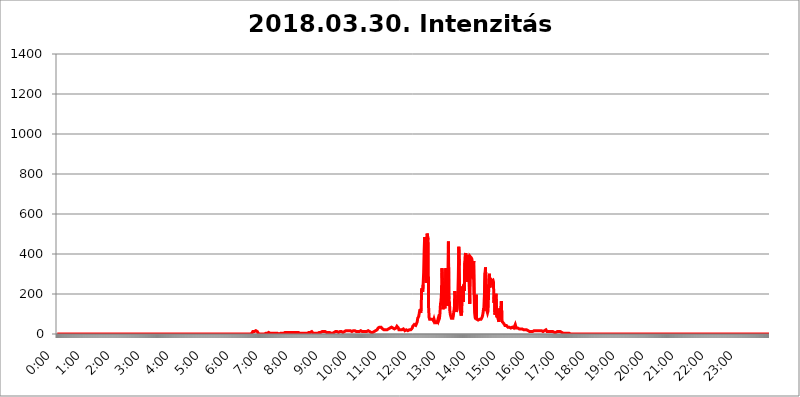
| Category | 2018.03.30. Intenzitás [W/m^2] |
|---|---|
| 0.0 | 0 |
| 0.0006944444444444445 | 0 |
| 0.001388888888888889 | 0 |
| 0.0020833333333333333 | 0 |
| 0.002777777777777778 | 0 |
| 0.003472222222222222 | 0 |
| 0.004166666666666667 | 0 |
| 0.004861111111111111 | 0 |
| 0.005555555555555556 | 0 |
| 0.0062499999999999995 | 0 |
| 0.006944444444444444 | 0 |
| 0.007638888888888889 | 0 |
| 0.008333333333333333 | 0 |
| 0.009027777777777779 | 0 |
| 0.009722222222222222 | 0 |
| 0.010416666666666666 | 0 |
| 0.011111111111111112 | 0 |
| 0.011805555555555555 | 0 |
| 0.012499999999999999 | 0 |
| 0.013194444444444444 | 0 |
| 0.013888888888888888 | 0 |
| 0.014583333333333332 | 0 |
| 0.015277777777777777 | 0 |
| 0.015972222222222224 | 0 |
| 0.016666666666666666 | 0 |
| 0.017361111111111112 | 0 |
| 0.018055555555555557 | 0 |
| 0.01875 | 0 |
| 0.019444444444444445 | 0 |
| 0.02013888888888889 | 0 |
| 0.020833333333333332 | 0 |
| 0.02152777777777778 | 0 |
| 0.022222222222222223 | 0 |
| 0.02291666666666667 | 0 |
| 0.02361111111111111 | 0 |
| 0.024305555555555556 | 0 |
| 0.024999999999999998 | 0 |
| 0.025694444444444447 | 0 |
| 0.02638888888888889 | 0 |
| 0.027083333333333334 | 0 |
| 0.027777777777777776 | 0 |
| 0.02847222222222222 | 0 |
| 0.029166666666666664 | 0 |
| 0.029861111111111113 | 0 |
| 0.030555555555555555 | 0 |
| 0.03125 | 0 |
| 0.03194444444444445 | 0 |
| 0.03263888888888889 | 0 |
| 0.03333333333333333 | 0 |
| 0.034027777777777775 | 0 |
| 0.034722222222222224 | 0 |
| 0.035416666666666666 | 0 |
| 0.036111111111111115 | 0 |
| 0.03680555555555556 | 0 |
| 0.0375 | 0 |
| 0.03819444444444444 | 0 |
| 0.03888888888888889 | 0 |
| 0.03958333333333333 | 0 |
| 0.04027777777777778 | 0 |
| 0.04097222222222222 | 0 |
| 0.041666666666666664 | 0 |
| 0.042361111111111106 | 0 |
| 0.04305555555555556 | 0 |
| 0.043750000000000004 | 0 |
| 0.044444444444444446 | 0 |
| 0.04513888888888889 | 0 |
| 0.04583333333333334 | 0 |
| 0.04652777777777778 | 0 |
| 0.04722222222222222 | 0 |
| 0.04791666666666666 | 0 |
| 0.04861111111111111 | 0 |
| 0.049305555555555554 | 0 |
| 0.049999999999999996 | 0 |
| 0.05069444444444445 | 0 |
| 0.051388888888888894 | 0 |
| 0.052083333333333336 | 0 |
| 0.05277777777777778 | 0 |
| 0.05347222222222222 | 0 |
| 0.05416666666666667 | 0 |
| 0.05486111111111111 | 0 |
| 0.05555555555555555 | 0 |
| 0.05625 | 0 |
| 0.05694444444444444 | 0 |
| 0.057638888888888885 | 0 |
| 0.05833333333333333 | 0 |
| 0.05902777777777778 | 0 |
| 0.059722222222222225 | 0 |
| 0.06041666666666667 | 0 |
| 0.061111111111111116 | 0 |
| 0.06180555555555556 | 0 |
| 0.0625 | 0 |
| 0.06319444444444444 | 0 |
| 0.06388888888888888 | 0 |
| 0.06458333333333334 | 0 |
| 0.06527777777777778 | 0 |
| 0.06597222222222222 | 0 |
| 0.06666666666666667 | 0 |
| 0.06736111111111111 | 0 |
| 0.06805555555555555 | 0 |
| 0.06874999999999999 | 0 |
| 0.06944444444444443 | 0 |
| 0.07013888888888889 | 0 |
| 0.07083333333333333 | 0 |
| 0.07152777777777779 | 0 |
| 0.07222222222222223 | 0 |
| 0.07291666666666667 | 0 |
| 0.07361111111111111 | 0 |
| 0.07430555555555556 | 0 |
| 0.075 | 0 |
| 0.07569444444444444 | 0 |
| 0.0763888888888889 | 0 |
| 0.07708333333333334 | 0 |
| 0.07777777777777778 | 0 |
| 0.07847222222222222 | 0 |
| 0.07916666666666666 | 0 |
| 0.0798611111111111 | 0 |
| 0.08055555555555556 | 0 |
| 0.08125 | 0 |
| 0.08194444444444444 | 0 |
| 0.08263888888888889 | 0 |
| 0.08333333333333333 | 0 |
| 0.08402777777777777 | 0 |
| 0.08472222222222221 | 0 |
| 0.08541666666666665 | 0 |
| 0.08611111111111112 | 0 |
| 0.08680555555555557 | 0 |
| 0.08750000000000001 | 0 |
| 0.08819444444444445 | 0 |
| 0.08888888888888889 | 0 |
| 0.08958333333333333 | 0 |
| 0.09027777777777778 | 0 |
| 0.09097222222222222 | 0 |
| 0.09166666666666667 | 0 |
| 0.09236111111111112 | 0 |
| 0.09305555555555556 | 0 |
| 0.09375 | 0 |
| 0.09444444444444444 | 0 |
| 0.09513888888888888 | 0 |
| 0.09583333333333333 | 0 |
| 0.09652777777777777 | 0 |
| 0.09722222222222222 | 0 |
| 0.09791666666666667 | 0 |
| 0.09861111111111111 | 0 |
| 0.09930555555555555 | 0 |
| 0.09999999999999999 | 0 |
| 0.10069444444444443 | 0 |
| 0.1013888888888889 | 0 |
| 0.10208333333333335 | 0 |
| 0.10277777777777779 | 0 |
| 0.10347222222222223 | 0 |
| 0.10416666666666667 | 0 |
| 0.10486111111111111 | 0 |
| 0.10555555555555556 | 0 |
| 0.10625 | 0 |
| 0.10694444444444444 | 0 |
| 0.1076388888888889 | 0 |
| 0.10833333333333334 | 0 |
| 0.10902777777777778 | 0 |
| 0.10972222222222222 | 0 |
| 0.1111111111111111 | 0 |
| 0.11180555555555556 | 0 |
| 0.11180555555555556 | 0 |
| 0.1125 | 0 |
| 0.11319444444444444 | 0 |
| 0.11388888888888889 | 0 |
| 0.11458333333333333 | 0 |
| 0.11527777777777777 | 0 |
| 0.11597222222222221 | 0 |
| 0.11666666666666665 | 0 |
| 0.1173611111111111 | 0 |
| 0.11805555555555557 | 0 |
| 0.11944444444444445 | 0 |
| 0.12013888888888889 | 0 |
| 0.12083333333333333 | 0 |
| 0.12152777777777778 | 0 |
| 0.12222222222222223 | 0 |
| 0.12291666666666667 | 0 |
| 0.12291666666666667 | 0 |
| 0.12361111111111112 | 0 |
| 0.12430555555555556 | 0 |
| 0.125 | 0 |
| 0.12569444444444444 | 0 |
| 0.12638888888888888 | 0 |
| 0.12708333333333333 | 0 |
| 0.16875 | 0 |
| 0.12847222222222224 | 0 |
| 0.12916666666666668 | 0 |
| 0.12986111111111112 | 0 |
| 0.13055555555555556 | 0 |
| 0.13125 | 0 |
| 0.13194444444444445 | 0 |
| 0.1326388888888889 | 0 |
| 0.13333333333333333 | 0 |
| 0.13402777777777777 | 0 |
| 0.13402777777777777 | 0 |
| 0.13472222222222222 | 0 |
| 0.13541666666666666 | 0 |
| 0.1361111111111111 | 0 |
| 0.13749999999999998 | 0 |
| 0.13819444444444443 | 0 |
| 0.1388888888888889 | 0 |
| 0.13958333333333334 | 0 |
| 0.14027777777777778 | 0 |
| 0.14097222222222222 | 0 |
| 0.14166666666666666 | 0 |
| 0.1423611111111111 | 0 |
| 0.14305555555555557 | 0 |
| 0.14375000000000002 | 0 |
| 0.14444444444444446 | 0 |
| 0.1451388888888889 | 0 |
| 0.1451388888888889 | 0 |
| 0.14652777777777778 | 0 |
| 0.14722222222222223 | 0 |
| 0.14791666666666667 | 0 |
| 0.1486111111111111 | 0 |
| 0.14930555555555555 | 0 |
| 0.15 | 0 |
| 0.15069444444444444 | 0 |
| 0.15138888888888888 | 0 |
| 0.15208333333333332 | 0 |
| 0.15277777777777776 | 0 |
| 0.15347222222222223 | 0 |
| 0.15416666666666667 | 0 |
| 0.15486111111111112 | 0 |
| 0.15555555555555556 | 0 |
| 0.15625 | 0 |
| 0.15694444444444444 | 0 |
| 0.15763888888888888 | 0 |
| 0.15833333333333333 | 0 |
| 0.15902777777777777 | 0 |
| 0.15972222222222224 | 0 |
| 0.16041666666666668 | 0 |
| 0.16111111111111112 | 0 |
| 0.16180555555555556 | 0 |
| 0.1625 | 0 |
| 0.16319444444444445 | 0 |
| 0.1638888888888889 | 0 |
| 0.16458333333333333 | 0 |
| 0.16527777777777777 | 0 |
| 0.16597222222222222 | 0 |
| 0.16666666666666666 | 0 |
| 0.1673611111111111 | 0 |
| 0.16805555555555554 | 0 |
| 0.16874999999999998 | 0 |
| 0.16944444444444443 | 0 |
| 0.17013888888888887 | 0 |
| 0.1708333333333333 | 0 |
| 0.17152777777777775 | 0 |
| 0.17222222222222225 | 0 |
| 0.1729166666666667 | 0 |
| 0.17361111111111113 | 0 |
| 0.17430555555555557 | 0 |
| 0.17500000000000002 | 0 |
| 0.17569444444444446 | 0 |
| 0.1763888888888889 | 0 |
| 0.17708333333333334 | 0 |
| 0.17777777777777778 | 0 |
| 0.17847222222222223 | 0 |
| 0.17916666666666667 | 0 |
| 0.1798611111111111 | 0 |
| 0.18055555555555555 | 0 |
| 0.18125 | 0 |
| 0.18194444444444444 | 0 |
| 0.1826388888888889 | 0 |
| 0.18333333333333335 | 0 |
| 0.1840277777777778 | 0 |
| 0.18472222222222223 | 0 |
| 0.18541666666666667 | 0 |
| 0.18611111111111112 | 0 |
| 0.18680555555555556 | 0 |
| 0.1875 | 0 |
| 0.18819444444444444 | 0 |
| 0.18888888888888888 | 0 |
| 0.18958333333333333 | 0 |
| 0.19027777777777777 | 0 |
| 0.1909722222222222 | 0 |
| 0.19166666666666665 | 0 |
| 0.19236111111111112 | 0 |
| 0.19305555555555554 | 0 |
| 0.19375 | 0 |
| 0.19444444444444445 | 0 |
| 0.1951388888888889 | 0 |
| 0.19583333333333333 | 0 |
| 0.19652777777777777 | 0 |
| 0.19722222222222222 | 0 |
| 0.19791666666666666 | 0 |
| 0.1986111111111111 | 0 |
| 0.19930555555555554 | 0 |
| 0.19999999999999998 | 0 |
| 0.20069444444444443 | 0 |
| 0.20138888888888887 | 0 |
| 0.2020833333333333 | 0 |
| 0.2027777777777778 | 0 |
| 0.2034722222222222 | 0 |
| 0.2041666666666667 | 0 |
| 0.20486111111111113 | 0 |
| 0.20555555555555557 | 0 |
| 0.20625000000000002 | 0 |
| 0.20694444444444446 | 0 |
| 0.2076388888888889 | 0 |
| 0.20833333333333334 | 0 |
| 0.20902777777777778 | 0 |
| 0.20972222222222223 | 0 |
| 0.21041666666666667 | 0 |
| 0.2111111111111111 | 0 |
| 0.21180555555555555 | 0 |
| 0.2125 | 0 |
| 0.21319444444444444 | 0 |
| 0.2138888888888889 | 0 |
| 0.21458333333333335 | 0 |
| 0.2152777777777778 | 0 |
| 0.21597222222222223 | 0 |
| 0.21666666666666667 | 0 |
| 0.21736111111111112 | 0 |
| 0.21805555555555556 | 0 |
| 0.21875 | 0 |
| 0.21944444444444444 | 0 |
| 0.22013888888888888 | 0 |
| 0.22083333333333333 | 0 |
| 0.22152777777777777 | 0 |
| 0.2222222222222222 | 0 |
| 0.22291666666666665 | 0 |
| 0.2236111111111111 | 0 |
| 0.22430555555555556 | 0 |
| 0.225 | 0 |
| 0.22569444444444445 | 0 |
| 0.2263888888888889 | 0 |
| 0.22708333333333333 | 0 |
| 0.22777777777777777 | 0 |
| 0.22847222222222222 | 0 |
| 0.22916666666666666 | 0 |
| 0.2298611111111111 | 0 |
| 0.23055555555555554 | 0 |
| 0.23124999999999998 | 0 |
| 0.23194444444444443 | 0 |
| 0.23263888888888887 | 0 |
| 0.2333333333333333 | 0 |
| 0.2340277777777778 | 0 |
| 0.2347222222222222 | 0 |
| 0.2354166666666667 | 0 |
| 0.23611111111111113 | 0 |
| 0.23680555555555557 | 0 |
| 0.23750000000000002 | 0 |
| 0.23819444444444446 | 0 |
| 0.2388888888888889 | 0 |
| 0.23958333333333334 | 0 |
| 0.24027777777777778 | 0 |
| 0.24097222222222223 | 0 |
| 0.24166666666666667 | 0 |
| 0.2423611111111111 | 0 |
| 0.24305555555555555 | 0 |
| 0.24375 | 0 |
| 0.24444444444444446 | 0 |
| 0.24513888888888888 | 0 |
| 0.24583333333333335 | 0 |
| 0.2465277777777778 | 0 |
| 0.24722222222222223 | 0 |
| 0.24791666666666667 | 0 |
| 0.24861111111111112 | 0 |
| 0.24930555555555556 | 0 |
| 0.25 | 0 |
| 0.25069444444444444 | 0 |
| 0.2513888888888889 | 0 |
| 0.2520833333333333 | 0 |
| 0.25277777777777777 | 0 |
| 0.2534722222222222 | 0 |
| 0.25416666666666665 | 0 |
| 0.2548611111111111 | 0 |
| 0.2555555555555556 | 0 |
| 0.25625000000000003 | 0 |
| 0.2569444444444445 | 0 |
| 0.2576388888888889 | 0 |
| 0.25833333333333336 | 0 |
| 0.2590277777777778 | 0 |
| 0.25972222222222224 | 0 |
| 0.2604166666666667 | 0 |
| 0.2611111111111111 | 0 |
| 0.26180555555555557 | 0 |
| 0.2625 | 0 |
| 0.26319444444444445 | 0 |
| 0.2638888888888889 | 0 |
| 0.26458333333333334 | 0 |
| 0.2652777777777778 | 0 |
| 0.2659722222222222 | 0 |
| 0.26666666666666666 | 0 |
| 0.2673611111111111 | 0 |
| 0.26805555555555555 | 0 |
| 0.26875 | 0 |
| 0.26944444444444443 | 0 |
| 0.2701388888888889 | 0 |
| 0.2708333333333333 | 0 |
| 0.27152777777777776 | 3.525 |
| 0.2722222222222222 | 3.525 |
| 0.27291666666666664 | 3.525 |
| 0.2736111111111111 | 7.887 |
| 0.2743055555555555 | 12.257 |
| 0.27499999999999997 | 12.257 |
| 0.27569444444444446 | 12.257 |
| 0.27638888888888885 | 12.257 |
| 0.27708333333333335 | 12.257 |
| 0.2777777777777778 | 12.257 |
| 0.27847222222222223 | 16.636 |
| 0.2791666666666667 | 21.024 |
| 0.2798611111111111 | 16.636 |
| 0.28055555555555556 | 12.257 |
| 0.28125 | 7.887 |
| 0.28194444444444444 | 3.525 |
| 0.2826388888888889 | 3.525 |
| 0.2833333333333333 | 0 |
| 0.28402777777777777 | 0 |
| 0.2847222222222222 | 0 |
| 0.28541666666666665 | 0 |
| 0.28611111111111115 | 0 |
| 0.28680555555555554 | 0 |
| 0.28750000000000003 | 0 |
| 0.2881944444444445 | 0 |
| 0.2888888888888889 | 0 |
| 0.28958333333333336 | 0 |
| 0.2902777777777778 | 0 |
| 0.29097222222222224 | 3.525 |
| 0.2916666666666667 | 3.525 |
| 0.2923611111111111 | 3.525 |
| 0.29305555555555557 | 3.525 |
| 0.29375 | 3.525 |
| 0.29444444444444445 | 3.525 |
| 0.2951388888888889 | 3.525 |
| 0.29583333333333334 | 3.525 |
| 0.2965277777777778 | 7.887 |
| 0.2972222222222222 | 7.887 |
| 0.29791666666666666 | 7.887 |
| 0.2986111111111111 | 3.525 |
| 0.29930555555555555 | 3.525 |
| 0.3 | 3.525 |
| 0.30069444444444443 | 3.525 |
| 0.3013888888888889 | 3.525 |
| 0.3020833333333333 | 3.525 |
| 0.30277777777777776 | 3.525 |
| 0.3034722222222222 | 3.525 |
| 0.30416666666666664 | 3.525 |
| 0.3048611111111111 | 3.525 |
| 0.3055555555555555 | 3.525 |
| 0.30624999999999997 | 3.525 |
| 0.3069444444444444 | 3.525 |
| 0.3076388888888889 | 3.525 |
| 0.30833333333333335 | 3.525 |
| 0.3090277777777778 | 3.525 |
| 0.30972222222222223 | 0 |
| 0.3104166666666667 | 0 |
| 0.3111111111111111 | 0 |
| 0.31180555555555556 | 0 |
| 0.3125 | 0 |
| 0.31319444444444444 | 3.525 |
| 0.3138888888888889 | 3.525 |
| 0.3145833333333333 | 3.525 |
| 0.31527777777777777 | 3.525 |
| 0.3159722222222222 | 3.525 |
| 0.31666666666666665 | 3.525 |
| 0.31736111111111115 | 3.525 |
| 0.31805555555555554 | 3.525 |
| 0.31875000000000003 | 3.525 |
| 0.3194444444444445 | 7.887 |
| 0.3201388888888889 | 7.887 |
| 0.32083333333333336 | 7.887 |
| 0.3215277777777778 | 7.887 |
| 0.32222222222222224 | 7.887 |
| 0.3229166666666667 | 7.887 |
| 0.3236111111111111 | 7.887 |
| 0.32430555555555557 | 7.887 |
| 0.325 | 7.887 |
| 0.32569444444444445 | 7.887 |
| 0.3263888888888889 | 7.887 |
| 0.32708333333333334 | 7.887 |
| 0.3277777777777778 | 7.887 |
| 0.3284722222222222 | 7.887 |
| 0.32916666666666666 | 7.887 |
| 0.3298611111111111 | 7.887 |
| 0.33055555555555555 | 7.887 |
| 0.33125 | 7.887 |
| 0.33194444444444443 | 7.887 |
| 0.3326388888888889 | 7.887 |
| 0.3333333333333333 | 7.887 |
| 0.3340277777777778 | 7.887 |
| 0.3347222222222222 | 7.887 |
| 0.3354166666666667 | 7.887 |
| 0.3361111111111111 | 7.887 |
| 0.3368055555555556 | 7.887 |
| 0.33749999999999997 | 7.887 |
| 0.33819444444444446 | 7.887 |
| 0.33888888888888885 | 3.525 |
| 0.33958333333333335 | 3.525 |
| 0.34027777777777773 | 3.525 |
| 0.34097222222222223 | 3.525 |
| 0.3416666666666666 | 3.525 |
| 0.3423611111111111 | 3.525 |
| 0.3430555555555555 | 3.525 |
| 0.34375 | 3.525 |
| 0.3444444444444445 | 3.525 |
| 0.3451388888888889 | 3.525 |
| 0.3458333333333334 | 3.525 |
| 0.34652777777777777 | 3.525 |
| 0.34722222222222227 | 3.525 |
| 0.34791666666666665 | 3.525 |
| 0.34861111111111115 | 3.525 |
| 0.34930555555555554 | 3.525 |
| 0.35000000000000003 | 3.525 |
| 0.3506944444444444 | 3.525 |
| 0.3513888888888889 | 3.525 |
| 0.3520833333333333 | 3.525 |
| 0.3527777777777778 | 7.887 |
| 0.3534722222222222 | 7.887 |
| 0.3541666666666667 | 7.887 |
| 0.3548611111111111 | 7.887 |
| 0.35555555555555557 | 7.887 |
| 0.35625 | 12.257 |
| 0.35694444444444445 | 12.257 |
| 0.3576388888888889 | 7.887 |
| 0.35833333333333334 | 7.887 |
| 0.3590277777777778 | 3.525 |
| 0.3597222222222222 | 3.525 |
| 0.36041666666666666 | 3.525 |
| 0.3611111111111111 | 3.525 |
| 0.36180555555555555 | 3.525 |
| 0.3625 | 3.525 |
| 0.36319444444444443 | 3.525 |
| 0.3638888888888889 | 3.525 |
| 0.3645833333333333 | 3.525 |
| 0.3652777777777778 | 3.525 |
| 0.3659722222222222 | 3.525 |
| 0.3666666666666667 | 3.525 |
| 0.3673611111111111 | 7.887 |
| 0.3680555555555556 | 7.887 |
| 0.36874999999999997 | 3.525 |
| 0.36944444444444446 | 7.887 |
| 0.37013888888888885 | 7.887 |
| 0.37083333333333335 | 12.257 |
| 0.37152777777777773 | 12.257 |
| 0.37222222222222223 | 12.257 |
| 0.3729166666666666 | 12.257 |
| 0.3736111111111111 | 12.257 |
| 0.3743055555555555 | 12.257 |
| 0.375 | 12.257 |
| 0.3756944444444445 | 12.257 |
| 0.3763888888888889 | 12.257 |
| 0.3770833333333334 | 12.257 |
| 0.37777777777777777 | 7.887 |
| 0.37847222222222227 | 7.887 |
| 0.37916666666666665 | 7.887 |
| 0.37986111111111115 | 7.887 |
| 0.38055555555555554 | 7.887 |
| 0.38125000000000003 | 7.887 |
| 0.3819444444444444 | 7.887 |
| 0.3826388888888889 | 7.887 |
| 0.3833333333333333 | 7.887 |
| 0.3840277777777778 | 3.525 |
| 0.3847222222222222 | 7.887 |
| 0.3854166666666667 | 3.525 |
| 0.3861111111111111 | 3.525 |
| 0.38680555555555557 | 3.525 |
| 0.3875 | 7.887 |
| 0.38819444444444445 | 7.887 |
| 0.3888888888888889 | 7.887 |
| 0.38958333333333334 | 12.257 |
| 0.3902777777777778 | 12.257 |
| 0.3909722222222222 | 12.257 |
| 0.39166666666666666 | 16.636 |
| 0.3923611111111111 | 12.257 |
| 0.39305555555555555 | 12.257 |
| 0.39375 | 7.887 |
| 0.39444444444444443 | 7.887 |
| 0.3951388888888889 | 7.887 |
| 0.3958333333333333 | 7.887 |
| 0.3965277777777778 | 12.257 |
| 0.3972222222222222 | 12.257 |
| 0.3979166666666667 | 12.257 |
| 0.3986111111111111 | 12.257 |
| 0.3993055555555556 | 7.887 |
| 0.39999999999999997 | 7.887 |
| 0.40069444444444446 | 7.887 |
| 0.40138888888888885 | 12.257 |
| 0.40208333333333335 | 12.257 |
| 0.40277777777777773 | 12.257 |
| 0.40347222222222223 | 12.257 |
| 0.4041666666666666 | 12.257 |
| 0.4048611111111111 | 16.636 |
| 0.4055555555555555 | 16.636 |
| 0.40625 | 16.636 |
| 0.4069444444444445 | 16.636 |
| 0.4076388888888889 | 16.636 |
| 0.4083333333333334 | 16.636 |
| 0.40902777777777777 | 16.636 |
| 0.40972222222222227 | 16.636 |
| 0.41041666666666665 | 16.636 |
| 0.41111111111111115 | 16.636 |
| 0.41180555555555554 | 12.257 |
| 0.41250000000000003 | 12.257 |
| 0.4131944444444444 | 12.257 |
| 0.4138888888888889 | 12.257 |
| 0.4145833333333333 | 12.257 |
| 0.4152777777777778 | 16.636 |
| 0.4159722222222222 | 16.636 |
| 0.4166666666666667 | 16.636 |
| 0.4173611111111111 | 16.636 |
| 0.41805555555555557 | 16.636 |
| 0.41875 | 12.257 |
| 0.41944444444444445 | 12.257 |
| 0.4201388888888889 | 16.636 |
| 0.42083333333333334 | 12.257 |
| 0.4215277777777778 | 12.257 |
| 0.4222222222222222 | 12.257 |
| 0.42291666666666666 | 12.257 |
| 0.4236111111111111 | 12.257 |
| 0.42430555555555555 | 12.257 |
| 0.425 | 16.636 |
| 0.42569444444444443 | 16.636 |
| 0.4263888888888889 | 12.257 |
| 0.4270833333333333 | 12.257 |
| 0.4277777777777778 | 12.257 |
| 0.4284722222222222 | 7.887 |
| 0.4291666666666667 | 12.257 |
| 0.4298611111111111 | 12.257 |
| 0.4305555555555556 | 12.257 |
| 0.43124999999999997 | 12.257 |
| 0.43194444444444446 | 12.257 |
| 0.43263888888888885 | 12.257 |
| 0.43333333333333335 | 12.257 |
| 0.43402777777777773 | 12.257 |
| 0.43472222222222223 | 12.257 |
| 0.4354166666666666 | 12.257 |
| 0.4361111111111111 | 16.636 |
| 0.4368055555555555 | 21.024 |
| 0.4375 | 16.636 |
| 0.4381944444444445 | 12.257 |
| 0.4388888888888889 | 12.257 |
| 0.4395833333333334 | 7.887 |
| 0.44027777777777777 | 7.887 |
| 0.44097222222222227 | 7.887 |
| 0.44166666666666665 | 7.887 |
| 0.44236111111111115 | 7.887 |
| 0.44305555555555554 | 7.887 |
| 0.44375000000000003 | 12.257 |
| 0.4444444444444444 | 12.257 |
| 0.4451388888888889 | 12.257 |
| 0.4458333333333333 | 12.257 |
| 0.4465277777777778 | 16.636 |
| 0.4472222222222222 | 16.636 |
| 0.4479166666666667 | 16.636 |
| 0.4486111111111111 | 21.024 |
| 0.44930555555555557 | 25.419 |
| 0.45 | 29.823 |
| 0.45069444444444445 | 29.823 |
| 0.4513888888888889 | 34.234 |
| 0.45208333333333334 | 34.234 |
| 0.4527777777777778 | 38.653 |
| 0.4534722222222222 | 38.653 |
| 0.45416666666666666 | 34.234 |
| 0.4548611111111111 | 29.823 |
| 0.45555555555555555 | 29.823 |
| 0.45625 | 25.419 |
| 0.45694444444444443 | 21.024 |
| 0.4576388888888889 | 21.024 |
| 0.4583333333333333 | 21.024 |
| 0.4590277777777778 | 21.024 |
| 0.4597222222222222 | 21.024 |
| 0.4604166666666667 | 21.024 |
| 0.4611111111111111 | 21.024 |
| 0.4618055555555556 | 21.024 |
| 0.46249999999999997 | 21.024 |
| 0.46319444444444446 | 21.024 |
| 0.46388888888888885 | 21.024 |
| 0.46458333333333335 | 25.419 |
| 0.46527777777777773 | 29.823 |
| 0.46597222222222223 | 29.823 |
| 0.4666666666666666 | 29.823 |
| 0.4673611111111111 | 34.234 |
| 0.4680555555555555 | 34.234 |
| 0.46875 | 34.234 |
| 0.4694444444444445 | 34.234 |
| 0.4701388888888889 | 29.823 |
| 0.4708333333333334 | 29.823 |
| 0.47152777777777777 | 25.419 |
| 0.47222222222222227 | 25.419 |
| 0.47291666666666665 | 25.419 |
| 0.47361111111111115 | 29.823 |
| 0.47430555555555554 | 29.823 |
| 0.47500000000000003 | 29.823 |
| 0.4756944444444444 | 29.823 |
| 0.4763888888888889 | 38.653 |
| 0.4770833333333333 | 38.653 |
| 0.4777777777777778 | 34.234 |
| 0.4784722222222222 | 29.823 |
| 0.4791666666666667 | 21.024 |
| 0.4798611111111111 | 16.636 |
| 0.48055555555555557 | 21.024 |
| 0.48125 | 21.024 |
| 0.48194444444444445 | 21.024 |
| 0.4826388888888889 | 21.024 |
| 0.48333333333333334 | 21.024 |
| 0.4840277777777778 | 25.419 |
| 0.4847222222222222 | 25.419 |
| 0.48541666666666666 | 25.419 |
| 0.4861111111111111 | 21.024 |
| 0.48680555555555555 | 21.024 |
| 0.4875 | 16.636 |
| 0.48819444444444443 | 16.636 |
| 0.4888888888888889 | 16.636 |
| 0.4895833333333333 | 21.024 |
| 0.4902777777777778 | 21.024 |
| 0.4909722222222222 | 16.636 |
| 0.4916666666666667 | 16.636 |
| 0.4923611111111111 | 12.257 |
| 0.4930555555555556 | 16.636 |
| 0.49374999999999997 | 21.024 |
| 0.49444444444444446 | 21.024 |
| 0.49513888888888885 | 25.419 |
| 0.49583333333333335 | 21.024 |
| 0.49652777777777773 | 21.024 |
| 0.49722222222222223 | 25.419 |
| 0.4979166666666666 | 29.823 |
| 0.4986111111111111 | 38.653 |
| 0.4993055555555555 | 38.653 |
| 0.5 | 43.079 |
| 0.5006944444444444 | 47.511 |
| 0.5013888888888889 | 43.079 |
| 0.5020833333333333 | 43.079 |
| 0.5027777777777778 | 43.079 |
| 0.5034722222222222 | 43.079 |
| 0.5041666666666667 | 47.511 |
| 0.5048611111111111 | 60.85 |
| 0.5055555555555555 | 78.722 |
| 0.50625 | 83.205 |
| 0.5069444444444444 | 87.692 |
| 0.5076388888888889 | 101.184 |
| 0.5083333333333333 | 114.716 |
| 0.5090277777777777 | 123.758 |
| 0.5097222222222222 | 105.69 |
| 0.5104166666666666 | 128.284 |
| 0.5111111111111112 | 228.436 |
| 0.5118055555555555 | 219.309 |
| 0.5125000000000001 | 210.182 |
| 0.5131944444444444 | 246.689 |
| 0.513888888888889 | 305.898 |
| 0.5145833333333333 | 414.035 |
| 0.5152777777777778 | 484.735 |
| 0.5159722222222222 | 471.582 |
| 0.5166666666666667 | 378.224 |
| 0.517361111111111 | 255.813 |
| 0.5180555555555556 | 440.702 |
| 0.5187499999999999 | 502.192 |
| 0.5194444444444445 | 506.542 |
| 0.5201388888888888 | 471.582 |
| 0.5208333333333334 | 132.814 |
| 0.5215277777777778 | 83.205 |
| 0.5222222222222223 | 74.246 |
| 0.5229166666666667 | 78.722 |
| 0.5236111111111111 | 78.722 |
| 0.5243055555555556 | 74.246 |
| 0.525 | 69.775 |
| 0.5256944444444445 | 74.246 |
| 0.5263888888888889 | 74.246 |
| 0.5270833333333333 | 69.775 |
| 0.5277777777777778 | 65.31 |
| 0.5284722222222222 | 74.246 |
| 0.5291666666666667 | 65.31 |
| 0.5298611111111111 | 60.85 |
| 0.5305555555555556 | 56.398 |
| 0.53125 | 51.951 |
| 0.5319444444444444 | 51.951 |
| 0.5326388888888889 | 56.398 |
| 0.5333333333333333 | 65.31 |
| 0.5340277777777778 | 74.246 |
| 0.5347222222222222 | 65.31 |
| 0.5354166666666667 | 69.775 |
| 0.5361111111111111 | 78.722 |
| 0.5368055555555555 | 105.69 |
| 0.5375 | 150.964 |
| 0.5381944444444444 | 164.605 |
| 0.5388888888888889 | 205.62 |
| 0.5395833333333333 | 328.584 |
| 0.5402777777777777 | 269.49 |
| 0.5409722222222222 | 123.758 |
| 0.5416666666666666 | 128.284 |
| 0.5423611111111112 | 155.509 |
| 0.5430555555555555 | 141.884 |
| 0.5437500000000001 | 128.284 |
| 0.5444444444444444 | 128.284 |
| 0.545138888888889 | 328.584 |
| 0.5458333333333333 | 141.884 |
| 0.5465277777777778 | 169.156 |
| 0.5472222222222222 | 242.127 |
| 0.5479166666666667 | 278.603 |
| 0.548611111111111 | 462.786 |
| 0.5493055555555556 | 173.709 |
| 0.5499999999999999 | 160.056 |
| 0.5506944444444445 | 114.716 |
| 0.5513888888888888 | 96.682 |
| 0.5520833333333334 | 92.184 |
| 0.5527777777777778 | 78.722 |
| 0.5534722222222223 | 74.246 |
| 0.5541666666666667 | 74.246 |
| 0.5548611111111111 | 78.722 |
| 0.5555555555555556 | 92.184 |
| 0.55625 | 114.716 |
| 0.5569444444444445 | 128.284 |
| 0.5576388888888889 | 214.746 |
| 0.5583333333333333 | 178.264 |
| 0.5590277777777778 | 178.264 |
| 0.5597222222222222 | 110.201 |
| 0.5604166666666667 | 123.758 |
| 0.5611111111111111 | 146.423 |
| 0.5618055555555556 | 187.378 |
| 0.5625 | 287.709 |
| 0.5631944444444444 | 436.27 |
| 0.5638888888888889 | 342.162 |
| 0.5645833333333333 | 128.284 |
| 0.5652777777777778 | 114.716 |
| 0.5659722222222222 | 101.184 |
| 0.5666666666666667 | 92.184 |
| 0.5673611111111111 | 114.716 |
| 0.5680555555555555 | 237.564 |
| 0.56875 | 233 |
| 0.5694444444444444 | 160.056 |
| 0.5701388888888889 | 246.689 |
| 0.5708333333333333 | 214.746 |
| 0.5715277777777777 | 355.712 |
| 0.5722222222222222 | 396.164 |
| 0.5729166666666666 | 405.108 |
| 0.5736111111111112 | 328.584 |
| 0.5743055555555555 | 292.259 |
| 0.5750000000000001 | 342.162 |
| 0.5756944444444444 | 260.373 |
| 0.576388888888889 | 333.113 |
| 0.5770833333333333 | 396.164 |
| 0.5777777777777778 | 391.685 |
| 0.5784722222222222 | 150.964 |
| 0.5791666666666667 | 387.202 |
| 0.579861111111111 | 387.202 |
| 0.5805555555555556 | 391.685 |
| 0.5812499999999999 | 378.224 |
| 0.5819444444444445 | 364.728 |
| 0.5826388888888888 | 355.712 |
| 0.5833333333333334 | 274.047 |
| 0.5840277777777778 | 364.728 |
| 0.5847222222222223 | 196.497 |
| 0.5854166666666667 | 105.69 |
| 0.5861111111111111 | 83.205 |
| 0.5868055555555556 | 74.246 |
| 0.5875 | 196.497 |
| 0.5881944444444445 | 74.246 |
| 0.5888888888888889 | 78.722 |
| 0.5895833333333333 | 69.775 |
| 0.5902777777777778 | 69.775 |
| 0.5909722222222222 | 74.246 |
| 0.5916666666666667 | 74.246 |
| 0.5923611111111111 | 74.246 |
| 0.5930555555555556 | 74.246 |
| 0.59375 | 74.246 |
| 0.5944444444444444 | 74.246 |
| 0.5951388888888889 | 78.722 |
| 0.5958333333333333 | 83.205 |
| 0.5965277777777778 | 92.184 |
| 0.5972222222222222 | 105.69 |
| 0.5979166666666667 | 128.284 |
| 0.5986111111111111 | 114.716 |
| 0.5993055555555555 | 119.235 |
| 0.6 | 305.898 |
| 0.6006944444444444 | 333.113 |
| 0.6013888888888889 | 191.937 |
| 0.6020833333333333 | 141.884 |
| 0.6027777777777777 | 114.716 |
| 0.6034722222222222 | 105.69 |
| 0.6041666666666666 | 114.716 |
| 0.6048611111111112 | 114.716 |
| 0.6055555555555555 | 269.49 |
| 0.6062500000000001 | 301.354 |
| 0.6069444444444444 | 233 |
| 0.607638888888889 | 278.603 |
| 0.6083333333333333 | 251.251 |
| 0.6090277777777778 | 264.932 |
| 0.6097222222222222 | 260.373 |
| 0.6104166666666667 | 269.49 |
| 0.611111111111111 | 269.49 |
| 0.6118055555555556 | 260.373 |
| 0.6124999999999999 | 155.509 |
| 0.6131944444444445 | 191.937 |
| 0.6138888888888888 | 96.682 |
| 0.6145833333333334 | 105.69 |
| 0.6152777777777778 | 201.058 |
| 0.6159722222222223 | 132.814 |
| 0.6166666666666667 | 83.205 |
| 0.6173611111111111 | 110.201 |
| 0.6180555555555556 | 78.722 |
| 0.61875 | 74.246 |
| 0.6194444444444445 | 60.85 |
| 0.6201388888888889 | 60.85 |
| 0.6208333333333333 | 128.284 |
| 0.6215277777777778 | 69.775 |
| 0.6222222222222222 | 74.246 |
| 0.6229166666666667 | 164.605 |
| 0.6236111111111111 | 69.775 |
| 0.6243055555555556 | 60.85 |
| 0.625 | 56.398 |
| 0.6256944444444444 | 56.398 |
| 0.6263888888888889 | 51.951 |
| 0.6270833333333333 | 47.511 |
| 0.6277777777777778 | 43.079 |
| 0.6284722222222222 | 43.079 |
| 0.6291666666666667 | 43.079 |
| 0.6298611111111111 | 43.079 |
| 0.6305555555555555 | 38.653 |
| 0.63125 | 38.653 |
| 0.6319444444444444 | 34.234 |
| 0.6326388888888889 | 34.234 |
| 0.6333333333333333 | 34.234 |
| 0.6340277777777777 | 34.234 |
| 0.6347222222222222 | 34.234 |
| 0.6354166666666666 | 29.823 |
| 0.6361111111111112 | 29.823 |
| 0.6368055555555555 | 29.823 |
| 0.6375000000000001 | 34.234 |
| 0.6381944444444444 | 34.234 |
| 0.638888888888889 | 34.234 |
| 0.6395833333333333 | 34.234 |
| 0.6402777777777778 | 29.823 |
| 0.6409722222222222 | 29.823 |
| 0.6416666666666667 | 29.823 |
| 0.642361111111111 | 47.511 |
| 0.6430555555555556 | 38.653 |
| 0.6437499999999999 | 29.823 |
| 0.6444444444444445 | 29.823 |
| 0.6451388888888888 | 29.823 |
| 0.6458333333333334 | 29.823 |
| 0.6465277777777778 | 25.419 |
| 0.6472222222222223 | 25.419 |
| 0.6479166666666667 | 25.419 |
| 0.6486111111111111 | 25.419 |
| 0.6493055555555556 | 25.419 |
| 0.65 | 25.419 |
| 0.6506944444444445 | 21.024 |
| 0.6513888888888889 | 21.024 |
| 0.6520833333333333 | 25.419 |
| 0.6527777777777778 | 21.024 |
| 0.6534722222222222 | 21.024 |
| 0.6541666666666667 | 21.024 |
| 0.6548611111111111 | 21.024 |
| 0.6555555555555556 | 21.024 |
| 0.65625 | 21.024 |
| 0.6569444444444444 | 21.024 |
| 0.6576388888888889 | 21.024 |
| 0.6583333333333333 | 21.024 |
| 0.6590277777777778 | 16.636 |
| 0.6597222222222222 | 16.636 |
| 0.6604166666666667 | 16.636 |
| 0.6611111111111111 | 12.257 |
| 0.6618055555555555 | 12.257 |
| 0.6625 | 12.257 |
| 0.6631944444444444 | 12.257 |
| 0.6638888888888889 | 12.257 |
| 0.6645833333333333 | 12.257 |
| 0.6652777777777777 | 12.257 |
| 0.6659722222222222 | 12.257 |
| 0.6666666666666666 | 12.257 |
| 0.6673611111111111 | 12.257 |
| 0.6680555555555556 | 12.257 |
| 0.6687500000000001 | 16.636 |
| 0.6694444444444444 | 16.636 |
| 0.6701388888888888 | 16.636 |
| 0.6708333333333334 | 16.636 |
| 0.6715277777777778 | 16.636 |
| 0.6722222222222222 | 16.636 |
| 0.6729166666666666 | 16.636 |
| 0.6736111111111112 | 16.636 |
| 0.6743055555555556 | 16.636 |
| 0.6749999999999999 | 16.636 |
| 0.6756944444444444 | 16.636 |
| 0.6763888888888889 | 16.636 |
| 0.6770833333333334 | 16.636 |
| 0.6777777777777777 | 21.024 |
| 0.6784722222222223 | 21.024 |
| 0.6791666666666667 | 16.636 |
| 0.6798611111111111 | 16.636 |
| 0.6805555555555555 | 16.636 |
| 0.68125 | 12.257 |
| 0.6819444444444445 | 16.636 |
| 0.6826388888888889 | 16.636 |
| 0.6833333333333332 | 16.636 |
| 0.6840277777777778 | 16.636 |
| 0.6847222222222222 | 21.024 |
| 0.6854166666666667 | 21.024 |
| 0.686111111111111 | 16.636 |
| 0.6868055555555556 | 12.257 |
| 0.6875 | 12.257 |
| 0.6881944444444444 | 12.257 |
| 0.688888888888889 | 12.257 |
| 0.6895833333333333 | 16.636 |
| 0.6902777777777778 | 12.257 |
| 0.6909722222222222 | 12.257 |
| 0.6916666666666668 | 12.257 |
| 0.6923611111111111 | 12.257 |
| 0.6930555555555555 | 12.257 |
| 0.69375 | 12.257 |
| 0.6944444444444445 | 12.257 |
| 0.6951388888888889 | 12.257 |
| 0.6958333333333333 | 12.257 |
| 0.6965277777777777 | 7.887 |
| 0.6972222222222223 | 7.887 |
| 0.6979166666666666 | 7.887 |
| 0.6986111111111111 | 7.887 |
| 0.6993055555555556 | 7.887 |
| 0.7000000000000001 | 7.887 |
| 0.7006944444444444 | 12.257 |
| 0.7013888888888888 | 12.257 |
| 0.7020833333333334 | 12.257 |
| 0.7027777777777778 | 12.257 |
| 0.7034722222222222 | 12.257 |
| 0.7041666666666666 | 7.887 |
| 0.7048611111111112 | 7.887 |
| 0.7055555555555556 | 12.257 |
| 0.7062499999999999 | 7.887 |
| 0.7069444444444444 | 7.887 |
| 0.7076388888888889 | 7.887 |
| 0.7083333333333334 | 3.525 |
| 0.7090277777777777 | 3.525 |
| 0.7097222222222223 | 3.525 |
| 0.7104166666666667 | 3.525 |
| 0.7111111111111111 | 3.525 |
| 0.7118055555555555 | 3.525 |
| 0.7125 | 3.525 |
| 0.7131944444444445 | 3.525 |
| 0.7138888888888889 | 3.525 |
| 0.7145833333333332 | 3.525 |
| 0.7152777777777778 | 3.525 |
| 0.7159722222222222 | 3.525 |
| 0.7166666666666667 | 3.525 |
| 0.717361111111111 | 3.525 |
| 0.7180555555555556 | 3.525 |
| 0.71875 | 3.525 |
| 0.7194444444444444 | 3.525 |
| 0.720138888888889 | 0 |
| 0.7208333333333333 | 0 |
| 0.7215277777777778 | 0 |
| 0.7222222222222222 | 0 |
| 0.7229166666666668 | 0 |
| 0.7236111111111111 | 0 |
| 0.7243055555555555 | 0 |
| 0.725 | 0 |
| 0.7256944444444445 | 0 |
| 0.7263888888888889 | 0 |
| 0.7270833333333333 | 0 |
| 0.7277777777777777 | 0 |
| 0.7284722222222223 | 0 |
| 0.7291666666666666 | 0 |
| 0.7298611111111111 | 0 |
| 0.7305555555555556 | 0 |
| 0.7312500000000001 | 0 |
| 0.7319444444444444 | 0 |
| 0.7326388888888888 | 0 |
| 0.7333333333333334 | 0 |
| 0.7340277777777778 | 0 |
| 0.7347222222222222 | 0 |
| 0.7354166666666666 | 0 |
| 0.7361111111111112 | 0 |
| 0.7368055555555556 | 0 |
| 0.7374999999999999 | 0 |
| 0.7381944444444444 | 0 |
| 0.7388888888888889 | 0 |
| 0.7395833333333334 | 0 |
| 0.7402777777777777 | 0 |
| 0.7409722222222223 | 0 |
| 0.7416666666666667 | 0 |
| 0.7423611111111111 | 0 |
| 0.7430555555555555 | 0 |
| 0.74375 | 0 |
| 0.7444444444444445 | 0 |
| 0.7451388888888889 | 0 |
| 0.7458333333333332 | 0 |
| 0.7465277777777778 | 0 |
| 0.7472222222222222 | 0 |
| 0.7479166666666667 | 0 |
| 0.748611111111111 | 0 |
| 0.7493055555555556 | 0 |
| 0.75 | 0 |
| 0.7506944444444444 | 0 |
| 0.751388888888889 | 0 |
| 0.7520833333333333 | 0 |
| 0.7527777777777778 | 0 |
| 0.7534722222222222 | 0 |
| 0.7541666666666668 | 0 |
| 0.7548611111111111 | 0 |
| 0.7555555555555555 | 0 |
| 0.75625 | 0 |
| 0.7569444444444445 | 0 |
| 0.7576388888888889 | 0 |
| 0.7583333333333333 | 0 |
| 0.7590277777777777 | 0 |
| 0.7597222222222223 | 0 |
| 0.7604166666666666 | 0 |
| 0.7611111111111111 | 0 |
| 0.7618055555555556 | 0 |
| 0.7625000000000001 | 0 |
| 0.7631944444444444 | 0 |
| 0.7638888888888888 | 0 |
| 0.7645833333333334 | 0 |
| 0.7652777777777778 | 0 |
| 0.7659722222222222 | 0 |
| 0.7666666666666666 | 0 |
| 0.7673611111111112 | 0 |
| 0.7680555555555556 | 0 |
| 0.7687499999999999 | 0 |
| 0.7694444444444444 | 0 |
| 0.7701388888888889 | 0 |
| 0.7708333333333334 | 0 |
| 0.7715277777777777 | 0 |
| 0.7722222222222223 | 0 |
| 0.7729166666666667 | 0 |
| 0.7736111111111111 | 0 |
| 0.7743055555555555 | 0 |
| 0.775 | 0 |
| 0.7756944444444445 | 0 |
| 0.7763888888888889 | 0 |
| 0.7770833333333332 | 0 |
| 0.7777777777777778 | 0 |
| 0.7784722222222222 | 0 |
| 0.7791666666666667 | 0 |
| 0.779861111111111 | 0 |
| 0.7805555555555556 | 0 |
| 0.78125 | 0 |
| 0.7819444444444444 | 0 |
| 0.782638888888889 | 0 |
| 0.7833333333333333 | 0 |
| 0.7840277777777778 | 0 |
| 0.7847222222222222 | 0 |
| 0.7854166666666668 | 0 |
| 0.7861111111111111 | 0 |
| 0.7868055555555555 | 0 |
| 0.7875 | 0 |
| 0.7881944444444445 | 0 |
| 0.7888888888888889 | 0 |
| 0.7895833333333333 | 0 |
| 0.7902777777777777 | 0 |
| 0.7909722222222223 | 0 |
| 0.7916666666666666 | 0 |
| 0.7923611111111111 | 0 |
| 0.7930555555555556 | 0 |
| 0.7937500000000001 | 0 |
| 0.7944444444444444 | 0 |
| 0.7951388888888888 | 0 |
| 0.7958333333333334 | 0 |
| 0.7965277777777778 | 0 |
| 0.7972222222222222 | 0 |
| 0.7979166666666666 | 0 |
| 0.7986111111111112 | 0 |
| 0.7993055555555556 | 0 |
| 0.7999999999999999 | 0 |
| 0.8006944444444444 | 0 |
| 0.8013888888888889 | 0 |
| 0.8020833333333334 | 0 |
| 0.8027777777777777 | 0 |
| 0.8034722222222223 | 0 |
| 0.8041666666666667 | 0 |
| 0.8048611111111111 | 0 |
| 0.8055555555555555 | 0 |
| 0.80625 | 0 |
| 0.8069444444444445 | 0 |
| 0.8076388888888889 | 0 |
| 0.8083333333333332 | 0 |
| 0.8090277777777778 | 0 |
| 0.8097222222222222 | 0 |
| 0.8104166666666667 | 0 |
| 0.811111111111111 | 0 |
| 0.8118055555555556 | 0 |
| 0.8125 | 0 |
| 0.8131944444444444 | 0 |
| 0.813888888888889 | 0 |
| 0.8145833333333333 | 0 |
| 0.8152777777777778 | 0 |
| 0.8159722222222222 | 0 |
| 0.8166666666666668 | 0 |
| 0.8173611111111111 | 0 |
| 0.8180555555555555 | 0 |
| 0.81875 | 0 |
| 0.8194444444444445 | 0 |
| 0.8201388888888889 | 0 |
| 0.8208333333333333 | 0 |
| 0.8215277777777777 | 0 |
| 0.8222222222222223 | 0 |
| 0.8229166666666666 | 0 |
| 0.8236111111111111 | 0 |
| 0.8243055555555556 | 0 |
| 0.8250000000000001 | 0 |
| 0.8256944444444444 | 0 |
| 0.8263888888888888 | 0 |
| 0.8270833333333334 | 0 |
| 0.8277777777777778 | 0 |
| 0.8284722222222222 | 0 |
| 0.8291666666666666 | 0 |
| 0.8298611111111112 | 0 |
| 0.8305555555555556 | 0 |
| 0.8312499999999999 | 0 |
| 0.8319444444444444 | 0 |
| 0.8326388888888889 | 0 |
| 0.8333333333333334 | 0 |
| 0.8340277777777777 | 0 |
| 0.8347222222222223 | 0 |
| 0.8354166666666667 | 0 |
| 0.8361111111111111 | 0 |
| 0.8368055555555555 | 0 |
| 0.8375 | 0 |
| 0.8381944444444445 | 0 |
| 0.8388888888888889 | 0 |
| 0.8395833333333332 | 0 |
| 0.8402777777777778 | 0 |
| 0.8409722222222222 | 0 |
| 0.8416666666666667 | 0 |
| 0.842361111111111 | 0 |
| 0.8430555555555556 | 0 |
| 0.84375 | 0 |
| 0.8444444444444444 | 0 |
| 0.845138888888889 | 0 |
| 0.8458333333333333 | 0 |
| 0.8465277777777778 | 0 |
| 0.8472222222222222 | 0 |
| 0.8479166666666668 | 0 |
| 0.8486111111111111 | 0 |
| 0.8493055555555555 | 0 |
| 0.85 | 0 |
| 0.8506944444444445 | 0 |
| 0.8513888888888889 | 0 |
| 0.8520833333333333 | 0 |
| 0.8527777777777777 | 0 |
| 0.8534722222222223 | 0 |
| 0.8541666666666666 | 0 |
| 0.8548611111111111 | 0 |
| 0.8555555555555556 | 0 |
| 0.8562500000000001 | 0 |
| 0.8569444444444444 | 0 |
| 0.8576388888888888 | 0 |
| 0.8583333333333334 | 0 |
| 0.8590277777777778 | 0 |
| 0.8597222222222222 | 0 |
| 0.8604166666666666 | 0 |
| 0.8611111111111112 | 0 |
| 0.8618055555555556 | 0 |
| 0.8624999999999999 | 0 |
| 0.8631944444444444 | 0 |
| 0.8638888888888889 | 0 |
| 0.8645833333333334 | 0 |
| 0.8652777777777777 | 0 |
| 0.8659722222222223 | 0 |
| 0.8666666666666667 | 0 |
| 0.8673611111111111 | 0 |
| 0.8680555555555555 | 0 |
| 0.86875 | 0 |
| 0.8694444444444445 | 0 |
| 0.8701388888888889 | 0 |
| 0.8708333333333332 | 0 |
| 0.8715277777777778 | 0 |
| 0.8722222222222222 | 0 |
| 0.8729166666666667 | 0 |
| 0.873611111111111 | 0 |
| 0.8743055555555556 | 0 |
| 0.875 | 0 |
| 0.8756944444444444 | 0 |
| 0.876388888888889 | 0 |
| 0.8770833333333333 | 0 |
| 0.8777777777777778 | 0 |
| 0.8784722222222222 | 0 |
| 0.8791666666666668 | 0 |
| 0.8798611111111111 | 0 |
| 0.8805555555555555 | 0 |
| 0.88125 | 0 |
| 0.8819444444444445 | 0 |
| 0.8826388888888889 | 0 |
| 0.8833333333333333 | 0 |
| 0.8840277777777777 | 0 |
| 0.8847222222222223 | 0 |
| 0.8854166666666666 | 0 |
| 0.8861111111111111 | 0 |
| 0.8868055555555556 | 0 |
| 0.8875000000000001 | 0 |
| 0.8881944444444444 | 0 |
| 0.8888888888888888 | 0 |
| 0.8895833333333334 | 0 |
| 0.8902777777777778 | 0 |
| 0.8909722222222222 | 0 |
| 0.8916666666666666 | 0 |
| 0.8923611111111112 | 0 |
| 0.8930555555555556 | 0 |
| 0.8937499999999999 | 0 |
| 0.8944444444444444 | 0 |
| 0.8951388888888889 | 0 |
| 0.8958333333333334 | 0 |
| 0.8965277777777777 | 0 |
| 0.8972222222222223 | 0 |
| 0.8979166666666667 | 0 |
| 0.8986111111111111 | 0 |
| 0.8993055555555555 | 0 |
| 0.9 | 0 |
| 0.9006944444444445 | 0 |
| 0.9013888888888889 | 0 |
| 0.9020833333333332 | 0 |
| 0.9027777777777778 | 0 |
| 0.9034722222222222 | 0 |
| 0.9041666666666667 | 0 |
| 0.904861111111111 | 0 |
| 0.9055555555555556 | 0 |
| 0.90625 | 0 |
| 0.9069444444444444 | 0 |
| 0.907638888888889 | 0 |
| 0.9083333333333333 | 0 |
| 0.9090277777777778 | 0 |
| 0.9097222222222222 | 0 |
| 0.9104166666666668 | 0 |
| 0.9111111111111111 | 0 |
| 0.9118055555555555 | 0 |
| 0.9125 | 0 |
| 0.9131944444444445 | 0 |
| 0.9138888888888889 | 0 |
| 0.9145833333333333 | 0 |
| 0.9152777777777777 | 0 |
| 0.9159722222222223 | 0 |
| 0.9166666666666666 | 0 |
| 0.9173611111111111 | 0 |
| 0.9180555555555556 | 0 |
| 0.9187500000000001 | 0 |
| 0.9194444444444444 | 0 |
| 0.9201388888888888 | 0 |
| 0.9208333333333334 | 0 |
| 0.9215277777777778 | 0 |
| 0.9222222222222222 | 0 |
| 0.9229166666666666 | 0 |
| 0.9236111111111112 | 0 |
| 0.9243055555555556 | 0 |
| 0.9249999999999999 | 0 |
| 0.9256944444444444 | 0 |
| 0.9263888888888889 | 0 |
| 0.9270833333333334 | 0 |
| 0.9277777777777777 | 0 |
| 0.9284722222222223 | 0 |
| 0.9291666666666667 | 0 |
| 0.9298611111111111 | 0 |
| 0.9305555555555555 | 0 |
| 0.93125 | 0 |
| 0.9319444444444445 | 0 |
| 0.9326388888888889 | 0 |
| 0.9333333333333332 | 0 |
| 0.9340277777777778 | 0 |
| 0.9347222222222222 | 0 |
| 0.9354166666666667 | 0 |
| 0.936111111111111 | 0 |
| 0.9368055555555556 | 0 |
| 0.9375 | 0 |
| 0.9381944444444444 | 0 |
| 0.938888888888889 | 0 |
| 0.9395833333333333 | 0 |
| 0.9402777777777778 | 0 |
| 0.9409722222222222 | 0 |
| 0.9416666666666668 | 0 |
| 0.9423611111111111 | 0 |
| 0.9430555555555555 | 0 |
| 0.94375 | 0 |
| 0.9444444444444445 | 0 |
| 0.9451388888888889 | 0 |
| 0.9458333333333333 | 0 |
| 0.9465277777777777 | 0 |
| 0.9472222222222223 | 0 |
| 0.9479166666666666 | 0 |
| 0.9486111111111111 | 0 |
| 0.9493055555555556 | 0 |
| 0.9500000000000001 | 0 |
| 0.9506944444444444 | 0 |
| 0.9513888888888888 | 0 |
| 0.9520833333333334 | 0 |
| 0.9527777777777778 | 0 |
| 0.9534722222222222 | 0 |
| 0.9541666666666666 | 0 |
| 0.9548611111111112 | 0 |
| 0.9555555555555556 | 0 |
| 0.9562499999999999 | 0 |
| 0.9569444444444444 | 0 |
| 0.9576388888888889 | 0 |
| 0.9583333333333334 | 0 |
| 0.9590277777777777 | 0 |
| 0.9597222222222223 | 0 |
| 0.9604166666666667 | 0 |
| 0.9611111111111111 | 0 |
| 0.9618055555555555 | 0 |
| 0.9625 | 0 |
| 0.9631944444444445 | 0 |
| 0.9638888888888889 | 0 |
| 0.9645833333333332 | 0 |
| 0.9652777777777778 | 0 |
| 0.9659722222222222 | 0 |
| 0.9666666666666667 | 0 |
| 0.967361111111111 | 0 |
| 0.9680555555555556 | 0 |
| 0.96875 | 0 |
| 0.9694444444444444 | 0 |
| 0.970138888888889 | 0 |
| 0.9708333333333333 | 0 |
| 0.9715277777777778 | 0 |
| 0.9722222222222222 | 0 |
| 0.9729166666666668 | 0 |
| 0.9736111111111111 | 0 |
| 0.9743055555555555 | 0 |
| 0.975 | 0 |
| 0.9756944444444445 | 0 |
| 0.9763888888888889 | 0 |
| 0.9770833333333333 | 0 |
| 0.9777777777777777 | 0 |
| 0.9784722222222223 | 0 |
| 0.9791666666666666 | 0 |
| 0.9798611111111111 | 0 |
| 0.9805555555555556 | 0 |
| 0.9812500000000001 | 0 |
| 0.9819444444444444 | 0 |
| 0.9826388888888888 | 0 |
| 0.9833333333333334 | 0 |
| 0.9840277777777778 | 0 |
| 0.9847222222222222 | 0 |
| 0.9854166666666666 | 0 |
| 0.9861111111111112 | 0 |
| 0.9868055555555556 | 0 |
| 0.9874999999999999 | 0 |
| 0.9881944444444444 | 0 |
| 0.9888888888888889 | 0 |
| 0.9895833333333334 | 0 |
| 0.9902777777777777 | 0 |
| 0.9909722222222223 | 0 |
| 0.9916666666666667 | 0 |
| 0.9923611111111111 | 0 |
| 0.9930555555555555 | 0 |
| 0.99375 | 0 |
| 0.9944444444444445 | 0 |
| 0.9951388888888889 | 0 |
| 0.9958333333333332 | 0 |
| 0.9965277777777778 | 0 |
| 0.9972222222222222 | 0 |
| 0.9979166666666667 | 0 |
| 0.998611111111111 | 0 |
| 0.9993055555555556 | 0 |